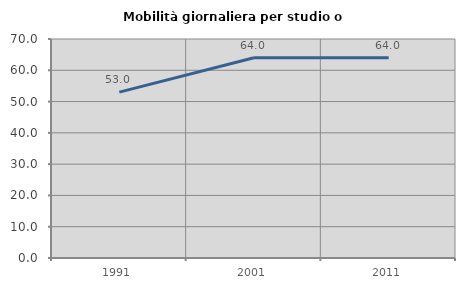
| Category | Mobilità giornaliera per studio o lavoro |
|---|---|
| 1991.0 | 53.03 |
| 2001.0 | 63.99 |
| 2011.0 | 63.989 |